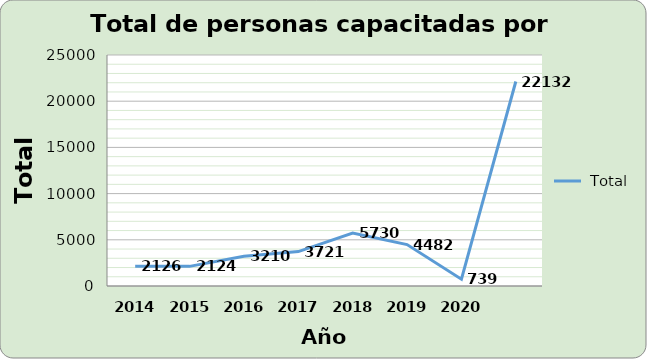
| Category | Total |
|---|---|
| 2014.0 | 2126 |
| 2015.0 | 2124 |
| 2016.0 | 3210 |
| 2017.0 | 3721 |
| 2018.0 | 5730 |
| 2019.0 | 4482 |
| 2020.0 | 739 |